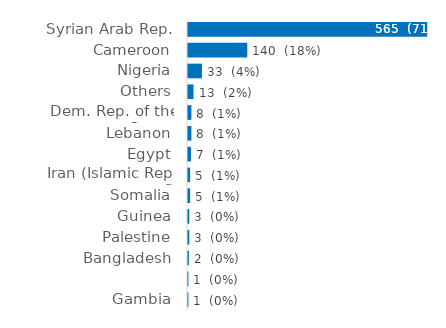
| Category | Series 0 |
|---|---|
| Syrian Arab Rep. | 565 |
| Cameroon | 140 |
| Nigeria | 33 |
| Others | 13 |
| Dem. Rep. of the Congo | 8 |
| Lebanon | 8 |
| Egypt | 7 |
| Iran (Islamic Rep. of) | 5 |
| Somalia | 5 |
| Guinea | 3 |
| Palestine | 3 |
| Bangladesh | 2 |
|  | 1 |
| Gambia | 1 |